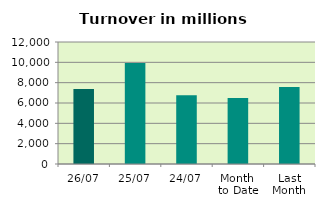
| Category | Series 0 |
|---|---|
| 26/07 | 7376.713 |
| 25/07 | 9946.084 |
| 24/07 | 6761.526 |
| Month 
to Date | 6494.062 |
| Last
Month | 7579.876 |